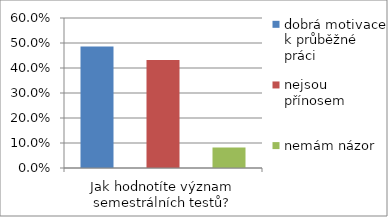
| Category | dobrá motivace k průběžné práci | nejsou přínosem | nemám názor |
|---|---|---|---|
| Jak hodnotíte význam semestrálních testů? | 0.486 | 0.432 | 0.082 |